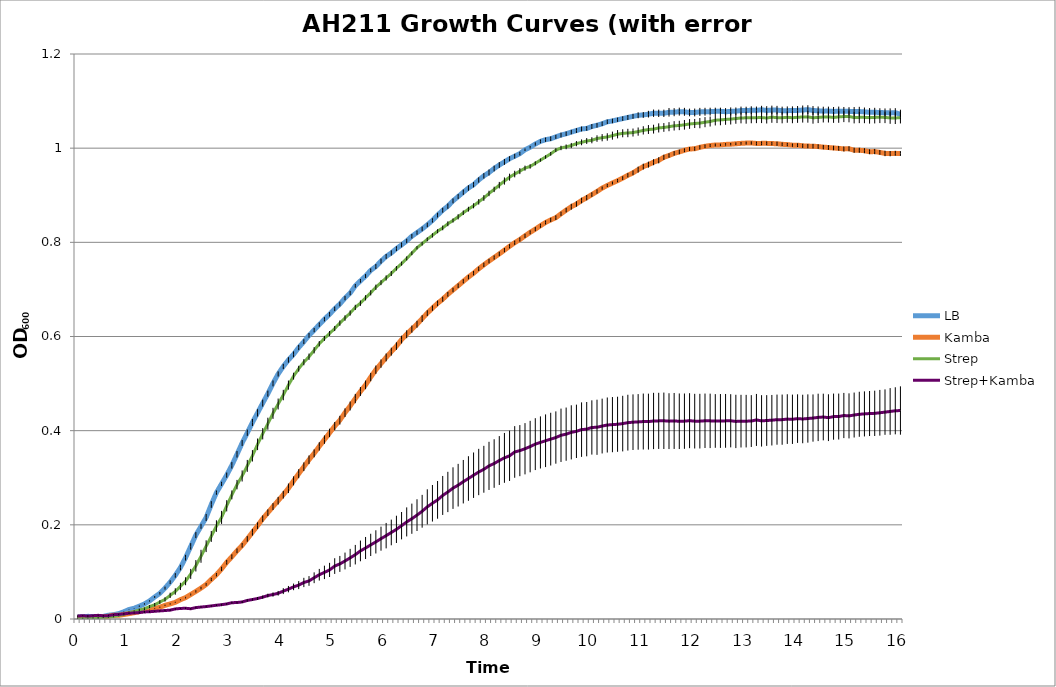
| Category | LB | Kamba | Strep | Strep+Kamba |
|---|---|---|---|---|
| 0.0 | 0.005 | 0.004 | 0 | 0.006 |
| nan | 0.005 | 0.003 | 0.001 | 0.007 |
| nan | 0.006 | 0.003 | 0.001 | 0.006 |
| nan | 0.005 | 0.003 | 0.002 | 0.007 |
| nan | 0.005 | 0.005 | 0.002 | 0.008 |
| nan | 0.005 | 0.004 | 0.004 | 0.007 |
| nan | 0.008 | 0.006 | 0.005 | 0.007 |
| nan | 0.009 | 0.008 | 0.006 | 0.009 |
| nan | 0.011 | 0.008 | 0.008 | 0.01 |
| nan | 0.015 | 0.01 | 0.01 | 0.011 |
| 1.0 | 0.02 | 0.011 | 0.013 | 0.012 |
| nan | 0.023 | 0.013 | 0.016 | 0.013 |
| nan | 0.027 | 0.015 | 0.019 | 0.014 |
| nan | 0.032 | 0.019 | 0.022 | 0.015 |
| nan | 0.038 | 0.019 | 0.026 | 0.015 |
| nan | 0.047 | 0.022 | 0.03 | 0.016 |
| nan | 0.055 | 0.025 | 0.036 | 0.017 |
| nan | 0.066 | 0.029 | 0.042 | 0.018 |
| nan | 0.078 | 0.032 | 0.05 | 0.019 |
| nan | 0.093 | 0.035 | 0.058 | 0.021 |
| 2.0 | 0.109 | 0.041 | 0.069 | 0.022 |
| nan | 0.13 | 0.045 | 0.08 | 0.023 |
| nan | 0.154 | 0.052 | 0.096 | 0.022 |
| nan | 0.178 | 0.059 | 0.113 | 0.024 |
| nan | 0.197 | 0.066 | 0.133 | 0.025 |
| nan | 0.216 | 0.073 | 0.155 | 0.026 |
| nan | 0.243 | 0.084 | 0.175 | 0.028 |
| nan | 0.268 | 0.094 | 0.197 | 0.029 |
| nan | 0.287 | 0.106 | 0.216 | 0.03 |
| nan | 0.306 | 0.12 | 0.24 | 0.032 |
| 3.0 | 0.326 | 0.132 | 0.264 | 0.035 |
| nan | 0.35 | 0.145 | 0.285 | 0.035 |
| nan | 0.374 | 0.156 | 0.304 | 0.036 |
| nan | 0.396 | 0.17 | 0.325 | 0.039 |
| nan | 0.417 | 0.184 | 0.347 | 0.041 |
| nan | 0.438 | 0.198 | 0.371 | 0.044 |
| nan | 0.458 | 0.213 | 0.393 | 0.046 |
| nan | 0.479 | 0.226 | 0.415 | 0.05 |
| nan | 0.5 | 0.239 | 0.437 | 0.052 |
| nan | 0.52 | 0.251 | 0.457 | 0.055 |
| 4.0 | 0.536 | 0.264 | 0.476 | 0.059 |
| nan | 0.55 | 0.278 | 0.497 | 0.063 |
| nan | 0.562 | 0.293 | 0.516 | 0.068 |
| nan | 0.577 | 0.309 | 0.532 | 0.072 |
| nan | 0.589 | 0.323 | 0.545 | 0.078 |
| nan | 0.602 | 0.338 | 0.557 | 0.081 |
| nan | 0.614 | 0.352 | 0.571 | 0.088 |
| nan | 0.625 | 0.367 | 0.585 | 0.094 |
| nan | 0.637 | 0.381 | 0.596 | 0.099 |
| nan | 0.647 | 0.395 | 0.606 | 0.104 |
| 5.0 | 0.659 | 0.41 | 0.617 | 0.112 |
| nan | 0.669 | 0.422 | 0.628 | 0.117 |
| nan | 0.682 | 0.438 | 0.639 | 0.123 |
| nan | 0.692 | 0.452 | 0.65 | 0.13 |
| nan | 0.708 | 0.468 | 0.662 | 0.137 |
| nan | 0.718 | 0.483 | 0.671 | 0.145 |
| nan | 0.728 | 0.497 | 0.682 | 0.151 |
| nan | 0.74 | 0.514 | 0.693 | 0.157 |
| nan | 0.749 | 0.529 | 0.705 | 0.164 |
| nan | 0.76 | 0.542 | 0.714 | 0.171 |
| 6.0 | 0.77 | 0.556 | 0.724 | 0.177 |
| nan | 0.777 | 0.568 | 0.734 | 0.184 |
| nan | 0.787 | 0.58 | 0.745 | 0.19 |
| nan | 0.795 | 0.593 | 0.755 | 0.198 |
| nan | 0.803 | 0.605 | 0.766 | 0.206 |
| nan | 0.813 | 0.616 | 0.777 | 0.213 |
| nan | 0.821 | 0.626 | 0.788 | 0.221 |
| nan | 0.828 | 0.638 | 0.797 | 0.229 |
| nan | 0.837 | 0.65 | 0.806 | 0.238 |
| nan | 0.847 | 0.66 | 0.815 | 0.246 |
| 7.0 | 0.858 | 0.67 | 0.824 | 0.253 |
| nan | 0.868 | 0.679 | 0.831 | 0.262 |
| nan | 0.877 | 0.69 | 0.839 | 0.27 |
| nan | 0.888 | 0.699 | 0.846 | 0.278 |
| nan | 0.897 | 0.708 | 0.854 | 0.284 |
| nan | 0.906 | 0.717 | 0.863 | 0.292 |
| nan | 0.915 | 0.726 | 0.87 | 0.298 |
| nan | 0.922 | 0.734 | 0.878 | 0.305 |
| nan | 0.932 | 0.744 | 0.886 | 0.312 |
| nan | 0.941 | 0.752 | 0.894 | 0.318 |
| 8.0 | 0.948 | 0.76 | 0.904 | 0.325 |
| nan | 0.957 | 0.768 | 0.912 | 0.33 |
| nan | 0.964 | 0.775 | 0.921 | 0.337 |
| nan | 0.971 | 0.783 | 0.93 | 0.342 |
| nan | 0.978 | 0.792 | 0.938 | 0.347 |
| nan | 0.983 | 0.799 | 0.945 | 0.355 |
| nan | 0.988 | 0.806 | 0.951 | 0.358 |
| nan | 0.997 | 0.814 | 0.958 | 0.362 |
| nan | 1.002 | 0.821 | 0.961 | 0.366 |
| nan | 1.009 | 0.828 | 0.968 | 0.371 |
| 9.0 | 1.014 | 0.835 | 0.975 | 0.375 |
| nan | 1.018 | 0.842 | 0.981 | 0.379 |
| nan | 1.02 | 0.848 | 0.988 | 0.382 |
| nan | 1.024 | 0.852 | 0.996 | 0.385 |
| nan | 1.028 | 0.861 | 1 | 0.39 |
| nan | 1.031 | 0.868 | 1.003 | 0.393 |
| nan | 1.034 | 0.876 | 1.006 | 0.396 |
| nan | 1.037 | 0.881 | 1.01 | 0.399 |
| nan | 1.041 | 0.889 | 1.012 | 0.402 |
| nan | 1.042 | 0.895 | 1.015 | 0.403 |
| 10.0 | 1.046 | 0.901 | 1.017 | 0.407 |
| nan | 1.049 | 0.908 | 1.02 | 0.407 |
| nan | 1.052 | 0.915 | 1.022 | 0.41 |
| nan | 1.056 | 0.921 | 1.024 | 0.412 |
| nan | 1.058 | 0.926 | 1.027 | 0.413 |
| nan | 1.06 | 0.931 | 1.03 | 0.414 |
| nan | 1.063 | 0.936 | 1.032 | 0.415 |
| nan | 1.065 | 0.942 | 1.032 | 0.417 |
| nan | 1.068 | 0.948 | 1.033 | 0.418 |
| nan | 1.07 | 0.954 | 1.035 | 0.419 |
| 11.0 | 1.071 | 0.961 | 1.038 | 0.419 |
| nan | 1.072 | 0.965 | 1.04 | 0.419 |
| nan | 1.074 | 0.97 | 1.04 | 0.421 |
| nan | 1.074 | 0.974 | 1.043 | 0.421 |
| nan | 1.074 | 0.981 | 1.044 | 0.421 |
| nan | 1.076 | 0.984 | 1.046 | 0.42 |
| nan | 1.076 | 0.989 | 1.047 | 0.421 |
| nan | 1.078 | 0.992 | 1.048 | 0.42 |
| nan | 1.077 | 0.996 | 1.05 | 0.42 |
| nan | 1.076 | 0.998 | 1.051 | 0.421 |
| 12.0 | 1.076 | 0.999 | 1.052 | 0.42 |
| nan | 1.077 | 1.002 | 1.053 | 0.42 |
| nan | 1.077 | 1.004 | 1.055 | 0.421 |
| nan | 1.078 | 1.006 | 1.057 | 0.421 |
| nan | 1.078 | 1.007 | 1.059 | 0.421 |
| nan | 1.078 | 1.007 | 1.06 | 0.421 |
| nan | 1.077 | 1.008 | 1.061 | 0.421 |
| nan | 1.078 | 1.008 | 1.062 | 0.421 |
| nan | 1.079 | 1.009 | 1.063 | 0.42 |
| nan | 1.08 | 1.01 | 1.064 | 0.42 |
| 13.0 | 1.08 | 1.011 | 1.064 | 0.42 |
| nan | 1.081 | 1.011 | 1.064 | 0.42 |
| nan | 1.08 | 1.01 | 1.065 | 0.423 |
| nan | 1.082 | 1.01 | 1.065 | 0.421 |
| nan | 1.08 | 1.01 | 1.064 | 0.422 |
| nan | 1.081 | 1.01 | 1.066 | 0.422 |
| nan | 1.081 | 1.009 | 1.065 | 0.423 |
| nan | 1.08 | 1.008 | 1.065 | 0.423 |
| nan | 1.08 | 1.008 | 1.066 | 0.425 |
| nan | 1.08 | 1.006 | 1.065 | 0.424 |
| 14.0 | 1.08 | 1.006 | 1.066 | 0.426 |
| nan | 1.081 | 1.005 | 1.066 | 0.425 |
| nan | 1.082 | 1.004 | 1.066 | 0.426 |
| nan | 1.08 | 1.004 | 1.065 | 0.427 |
| nan | 1.079 | 1.003 | 1.065 | 0.428 |
| nan | 1.079 | 1.002 | 1.066 | 0.429 |
| nan | 1.079 | 1.001 | 1.066 | 0.428 |
| nan | 1.078 | 1 | 1.065 | 0.43 |
| nan | 1.078 | 1 | 1.066 | 0.43 |
| nan | 1.078 | 0.998 | 1.067 | 0.432 |
| 15.0 | 1.078 | 0.999 | 1.067 | 0.431 |
| nan | 1.078 | 0.996 | 1.065 | 0.433 |
| nan | 1.078 | 0.996 | 1.065 | 0.435 |
| nan | 1.077 | 0.995 | 1.065 | 0.436 |
| nan | 1.076 | 0.992 | 1.065 | 0.436 |
| nan | 1.076 | 0.993 | 1.065 | 0.437 |
| nan | 1.076 | 0.991 | 1.066 | 0.438 |
| nan | 1.075 | 0.989 | 1.065 | 0.439 |
| nan | 1.075 | 0.988 | 1.064 | 0.441 |
| nan | 1.075 | 0.989 | 1.064 | 0.442 |
| 16.0 | 1.072 | 0.989 | 1.065 | 0.443 |